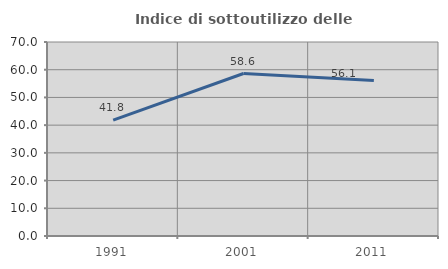
| Category | Indice di sottoutilizzo delle abitazioni  |
|---|---|
| 1991.0 | 41.818 |
| 2001.0 | 58.621 |
| 2011.0 | 56.14 |